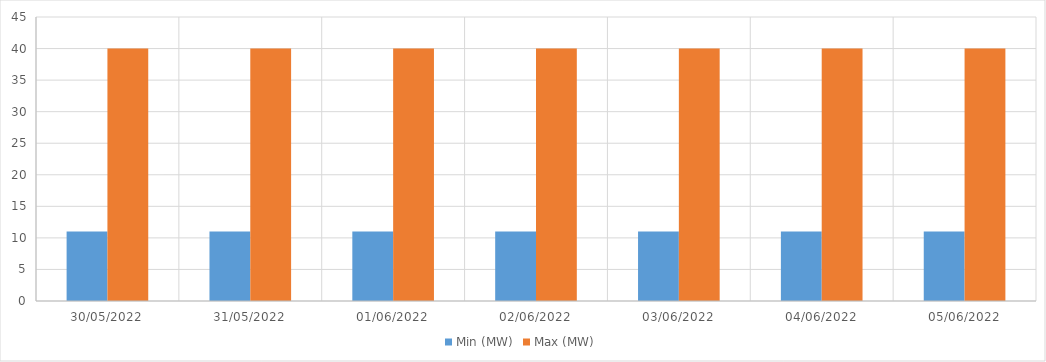
| Category | Min (MW) | Max (MW) |
|---|---|---|
| 30/05/2022 | 11 | 40 |
| 31/05/2022 | 11 | 40 |
| 01/06/2022 | 11 | 40 |
| 02/06/2022 | 11 | 40 |
| 03/06/2022 | 11 | 40 |
| 04/06/2022 | 11 | 40 |
| 05/06/2022 | 11 | 40 |